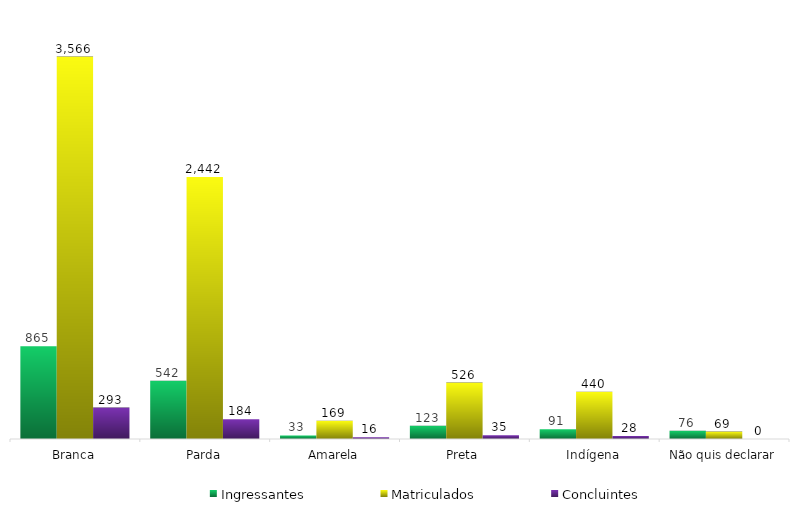
| Category | Ingressantes | Matriculados | Concluintes |
|---|---|---|---|
| Branca | 865 | 3566 | 293 |
| Parda | 542 | 2442 | 184 |
| Amarela | 33 | 169 | 16 |
| Preta | 123 | 526 | 35 |
| Indígena | 91 | 440 | 28 |
| Não quis declarar | 76 | 69 | 0 |